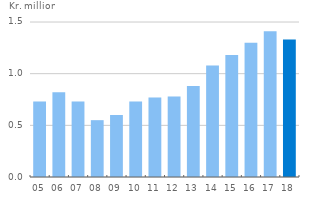
| Category | Financial net wealth
per household |
|---|---|
| 05 | 0.73 |
| 06 | 0.82 |
| 07 | 0.73 |
| 08 | 0.55 |
| 09 | 0.6 |
| 10 | 0.73 |
| 11 | 0.77 |
| 12 | 0.78 |
| 13 | 0.88 |
| 14 | 1.08 |
| 15 | 1.18 |
| 16 | 1.3 |
| 17 | 1.41 |
| 18 | 1.33 |